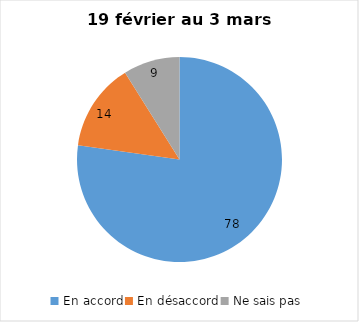
| Category | Series 0 |
|---|---|
| En accord | 78 |
| En désaccord | 14 |
| Ne sais pas | 9 |